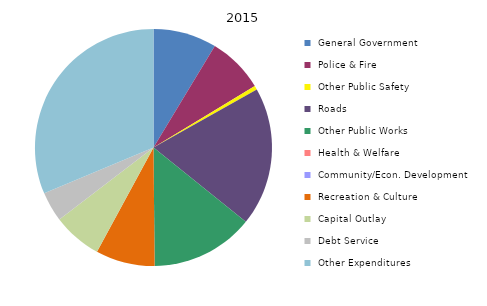
| Category | 2015 |
|---|---|
|  General Government  | 78783 |
|  Police & Fire  | 69764 |
|  Other Public Safety  | 4793 |
|  Roads   | 172381 |
|  Other Public Works  | 127943 |
|  Health & Welfare  | 0 |
|  Community/Econ. Development  | 0 |
|  Recreation & Culture  | 73392 |
|  Capital Outlay  | 61066 |
|  Debt Service  | 36907 |
|  Other Expenditures  | 285019 |